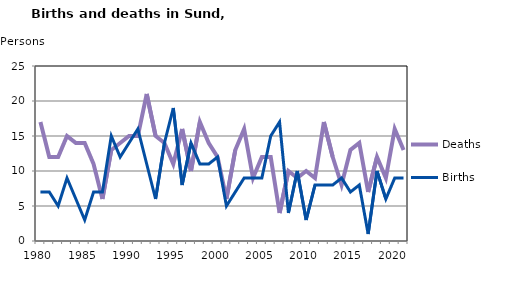
| Category | Deaths | Births |
|---|---|---|
| 1980.0 | 17 | 7 |
| 1981.0 | 12 | 7 |
| 1982.0 | 12 | 5 |
| 1983.0 | 15 | 9 |
| 1984.0 | 14 | 6 |
| 1985.0 | 14 | 3 |
| 1986.0 | 11 | 7 |
| 1987.0 | 6 | 7 |
| 1988.0 | 13 | 15 |
| 1989.0 | 14 | 12 |
| 1990.0 | 15 | 14 |
| 1991.0 | 15 | 16 |
| 1992.0 | 21 | 11 |
| 1993.0 | 15 | 6 |
| 1994.0 | 14 | 14 |
| 1995.0 | 11 | 19 |
| 1996.0 | 16 | 8 |
| 1997.0 | 10 | 14 |
| 1998.0 | 17 | 11 |
| 1999.0 | 14 | 11 |
| 2000.0 | 12 | 12 |
| 2001.0 | 6 | 5 |
| 2002.0 | 13 | 7 |
| 2003.0 | 16 | 9 |
| 2004.0 | 9 | 9 |
| 2005.0 | 12 | 9 |
| 2006.0 | 12 | 15 |
| 2007.0 | 4 | 17 |
| 2008.0 | 10 | 4 |
| 2009.0 | 9 | 10 |
| 2010.0 | 10 | 3 |
| 2011.0 | 9 | 8 |
| 2012.0 | 17 | 8 |
| 2013.0 | 12 | 8 |
| 2014.0 | 8 | 9 |
| 2015.0 | 13 | 7 |
| 2016.0 | 14 | 8 |
| 2017.0 | 7 | 1 |
| 2018.0 | 12 | 10 |
| 2019.0 | 9 | 6 |
| 2020.0 | 16 | 9 |
| 2021.0 | 13 | 9 |